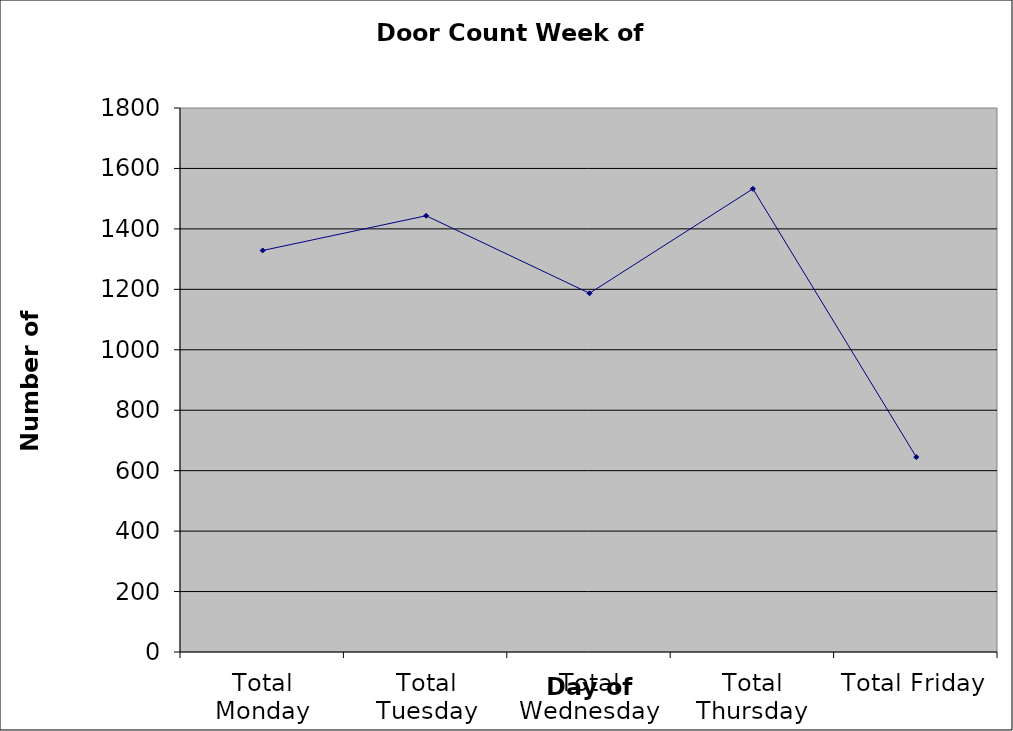
| Category | Series 0 |
|---|---|
| Total Monday | 1328.5 |
| Total Tuesday | 1443.5 |
| Total Wednesday | 1187 |
| Total Thursday | 1532.5 |
| Total Friday | 645 |